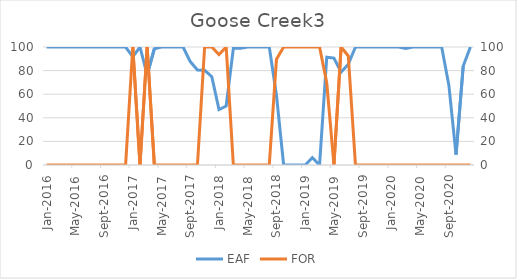
| Category | EAF |
|---|---|
| 2016-01-01 | 100 |
| 2016-02-01 | 100 |
| 2016-03-01 | 100 |
| 2016-04-01 | 100 |
| 2016-05-01 | 100 |
| 2016-06-01 | 100 |
| 2016-07-01 | 100 |
| 2016-08-01 | 100 |
| 2016-09-01 | 100 |
| 2016-10-01 | 100 |
| 2016-11-01 | 100 |
| 2016-12-01 | 100 |
| 2017-01-01 | 91.67 |
| 2017-02-01 | 100 |
| 2017-03-01 | 76.37 |
| 2017-04-01 | 98.48 |
| 2017-05-01 | 100 |
| 2017-06-01 | 100 |
| 2017-07-01 | 100 |
| 2017-08-01 | 100 |
| 2017-09-01 | 87.65 |
| 2017-10-01 | 80.58 |
| 2017-11-01 | 80.24 |
| 2017-12-01 | 74.8 |
| 2018-01-01 | 47.05 |
| 2018-02-01 | 50 |
| 2018-03-01 | 98.84 |
| 2018-04-01 | 98.86 |
| 2018-05-01 | 100 |
| 2018-06-01 | 100 |
| 2018-07-01 | 100 |
| 2018-08-01 | 100 |
| 2018-09-01 | 59.06 |
| 2018-10-01 | 0 |
| 2018-11-01 | 0 |
| 2018-12-01 | 0 |
| 2019-01-01 | 0 |
| 2019-02-01 | 6.18 |
| 2019-03-01 | 0 |
| 2019-04-01 | 91.39 |
| 2019-05-01 | 90.6 |
| 2019-06-01 | 78.66 |
| 2019-07-01 | 85.37 |
| 2019-08-01 | 100 |
| 2019-09-01 | 100 |
| 2019-10-01 | 100 |
| 2019-11-01 | 100 |
| 2019-12-01 | 100 |
| 2020-01-01 | 100 |
| 2020-02-01 | 100 |
| 2020-03-01 | 98.79 |
| 2020-04-01 | 100 |
| 2020-05-01 | 100 |
| 2020-06-01 | 100 |
| 2020-07-01 | 100 |
| 2020-08-01 | 100 |
| 2020-09-01 | 67.64 |
| 2020-10-01 | 8.77 |
| 2020-11-01 | 83.93 |
| 2020-12-01 | 100 |